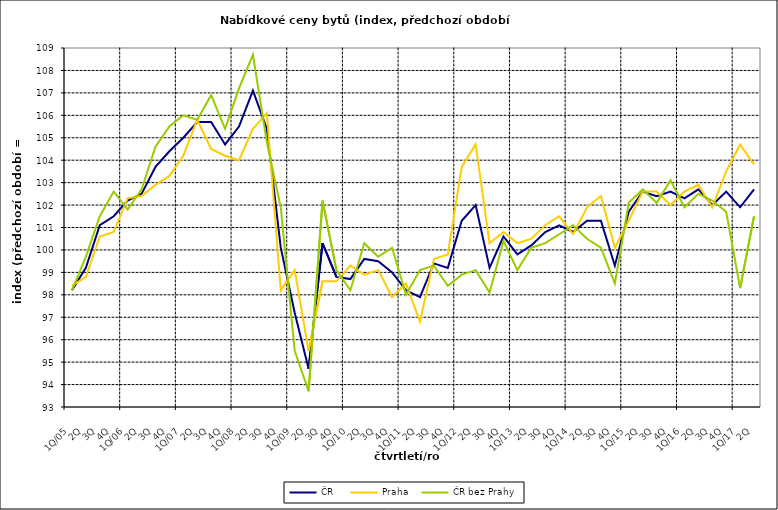
| Category | ČR  | Praha | ČR bez Prahy  |
|---|---|---|---|
| 1Q/05 | 98.2 | 98.4 | 98.2 |
| 2Q | 99.2 | 98.8 | 99.7 |
| 3Q | 101.1 | 100.6 | 101.5 |
| 4Q | 101.5 | 100.8 | 102.6 |
| 1Q/06 | 102.2 | 102.3 | 101.8 |
| 2Q | 102.5 | 102.4 | 102.7 |
| 3Q | 103.7 | 102.9 | 104.6 |
| 4Q | 104.4 | 103.3 | 105.5 |
| 1Q/07 | 105 | 104.2 | 106 |
| 2Q | 105.7 | 105.8 | 105.8 |
| 3Q | 105.7 | 104.5 | 106.9 |
| 4Q | 104.7 | 104.2 | 105.4 |
| 1Q/08 | 105.5 | 104 | 107.2 |
| 2Q | 107.1 | 105.4 | 108.7 |
| 3Q | 105.4 | 106.1 | 104.8 |
| 4Q | 100.1 | 98.2 | 101.9 |
| 1Q/09 | 97.2 | 99.1 | 95.5 |
| 2Q | 94.7 | 95.5 | 93.7 |
| 3Q | 100.3 | 98.6 | 102.2 |
| 4Q | 98.8 | 98.6 | 99.1 |
| 1Q/10 | 98.7 | 99.3 | 98.2 |
| 2Q | 99.6 | 98.9 | 100.3 |
| 3Q | 99.5 | 99.1 | 99.7 |
| 4Q | 99 | 97.9 | 100.1 |
| 1Q/11 | 98.2 | 98.5 | 98 |
| 2Q | 97.9 | 96.8 | 99.1 |
| 3Q | 99.4 | 99.6 | 99.3 |
| 4Q | 99.2 | 99.8 | 98.4 |
| 1Q/12 | 101.3 | 103.7 | 98.9 |
| 2Q | 102 | 104.7 | 99.1 |
| 3Q | 99.2 | 100.3 | 98.1 |
| 4Q | 100.6 | 100.8 | 100.4 |
| 1Q/13 | 99.8 | 100.3 | 99.1 |
| 2Q | 100.2 | 100.5 | 100.1 |
| 3Q | 100.8 | 101.1 | 100.3 |
| 4Q | 101.1 | 101.5 | 100.7 |
| 1Q/14 | 100.8 | 100.7 | 101.1 |
| 2Q | 101.3 | 101.9 | 100.5 |
| 3Q | 101.3 | 102.4 | 100.1 |
| 4Q | 99.3 | 100.1 | 98.5 |
| 1Q/15 | 101.7 | 101.3 | 102.1 |
| 2Q | 102.6 | 102.6 | 102.7 |
| 3Q | 102.4 | 102.6 | 102.1 |
| 4Q | 102.6 | 102 | 103.1 |
| 1Q/16 | 102.3 | 102.6 | 101.9 |
| 2Q | 102.7 | 102.9 | 102.5 |
| 3Q | 102 | 101.9 | 102.2 |
| 4Q | 102.6 | 103.5 | 101.7 |
| 1Q/17 | 101.9 | 104.7 | 98.3 |
| 2Q | 102.7 | 103.8 | 101.5 |